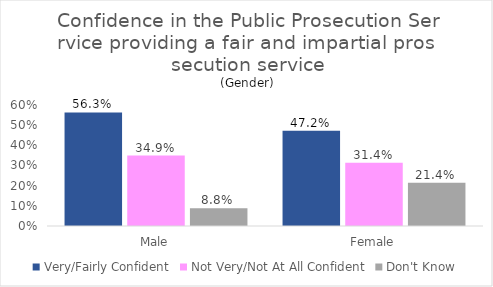
| Category | Very/Fairly Confident | Not Very/Not At All Confident | Don't Know |
|---|---|---|---|
| Male | 0.563 | 0.349 | 0.088 |
| Female | 0.472 | 0.314 | 0.214 |